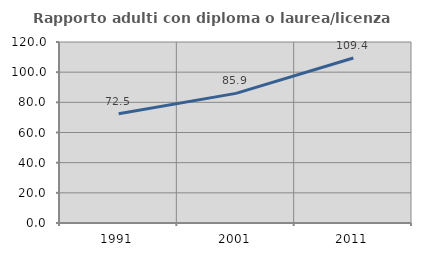
| Category | Rapporto adulti con diploma o laurea/licenza media  |
|---|---|
| 1991.0 | 72.481 |
| 2001.0 | 85.938 |
| 2011.0 | 109.404 |